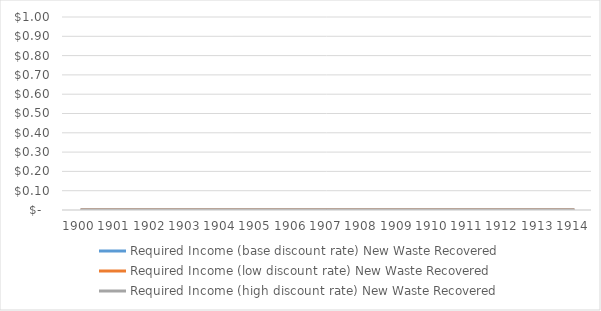
| Category | Required Income (base discount rate) New Waste Recovered | Required Income (low discount rate) New Waste Recovered | Required Income (high discount rate) New Waste Recovered |
|---|---|---|---|
| 1900.0 | 0 | 0 | 0 |
| 1901.0 | 0 | 0 | 0 |
| 1902.0 | 0 | 0 | 0 |
| 1903.0 | 0 | 0 | 0 |
| 1904.0 | 0 | 0 | 0 |
| 1905.0 | 0 | 0 | 0 |
| 1906.0 | 0 | 0 | 0 |
| 1907.0 | 0 | 0 | 0 |
| 1908.0 | 0 | 0 | 0 |
| 1909.0 | 0 | 0 | 0 |
| 1910.0 | 0 | 0 | 0 |
| 1911.0 | 0 | 0 | 0 |
| 1912.0 | 0 | 0 | 0 |
| 1913.0 | 0 | 0 | 0 |
| 1914.0 | 0 | 0 | 0 |